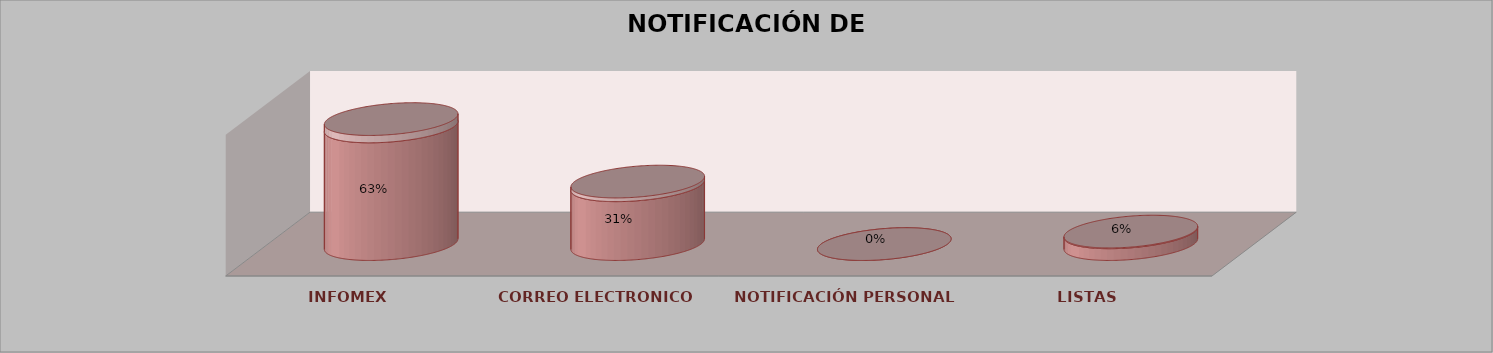
| Category | Series 0 | Series 1 | Series 2 | Series 3 | Series 4 |
|---|---|---|---|---|---|
| INFOMEX |  |  |  | 10 | 0.625 |
| CORREO ELECTRONICO |  |  |  | 5 | 0.312 |
| NOTIFICACIÓN PERSONAL |  |  |  | 0 | 0 |
| LISTAS |  |  |  | 1 | 0.062 |